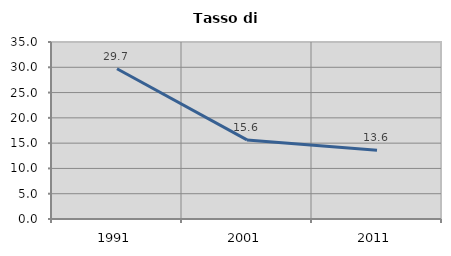
| Category | Tasso di disoccupazione   |
|---|---|
| 1991.0 | 29.718 |
| 2001.0 | 15.64 |
| 2011.0 | 13.614 |